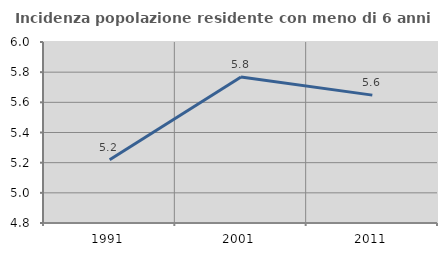
| Category | Incidenza popolazione residente con meno di 6 anni |
|---|---|
| 1991.0 | 5.219 |
| 2001.0 | 5.768 |
| 2011.0 | 5.648 |